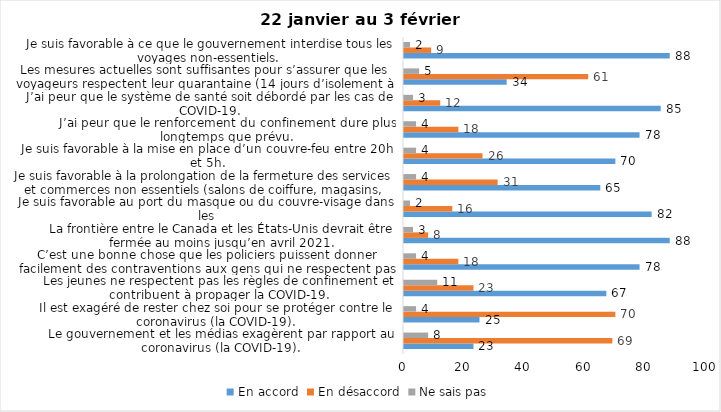
| Category | En accord | En désaccord | Ne sais pas |
|---|---|---|---|
| Le gouvernement et les médias exagèrent par rapport au coronavirus (la COVID-19). | 23 | 69 | 8 |
| Il est exagéré de rester chez soi pour se protéger contre le coronavirus (la COVID-19). | 25 | 70 | 4 |
| Les jeunes ne respectent pas les règles de confinement et contribuent à propager la COVID-19. | 67 | 23 | 11 |
| C’est une bonne chose que les policiers puissent donner facilement des contraventions aux gens qui ne respectent pas les mesures pour prévenir le coronavirus (la COVID-19). | 78 | 18 | 4 |
| La frontière entre le Canada et les États-Unis devrait être fermée au moins jusqu’en avril 2021. | 88 | 8 | 3 |
| Je suis favorable au port du masque ou du couvre-visage dans les
lieux publics extérieurs achalandés (ex. rues, parcs) | 82 | 16 | 2 |
| Je suis favorable à la prolongation de la fermeture des services et commerces non essentiels (salons de coiffure, magasins, industries) jusqu’au 8 février. | 65 | 31 | 4 |
| Je suis favorable à la mise en place d’un couvre-feu entre 20h et 5h. | 70 | 26 | 4 |
| J’ai peur que le renforcement du confinement dure plus longtemps que prévu. | 78 | 18 | 4 |
| J’ai peur que le système de santé soit débordé par les cas de COVID-19. | 85 | 12 | 3 |
| Les mesures actuelles sont suffisantes pour s’assurer que les voyageurs respectent leur quarantaine (14 jours d’isolement à la maison au retour d’un voyage). | 34 | 61 | 5 |
| Je suis favorable à ce que le gouvernement interdise tous les voyages non-essentiels. | 88 | 9 | 2 |